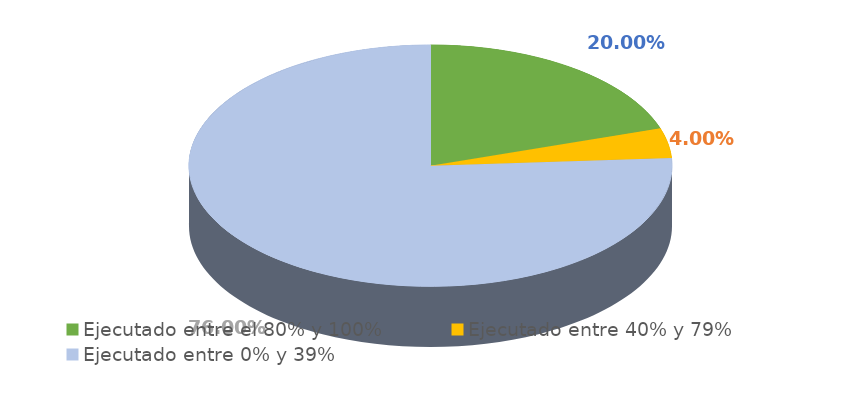
| Category | Series 0 |
|---|---|
| Ejecutado entre el 80% y 100% | 0.2 |
| Ejecutado entre 40% y 79% | 0.04 |
| Ejecutado entre 0% y 39% | 0.76 |